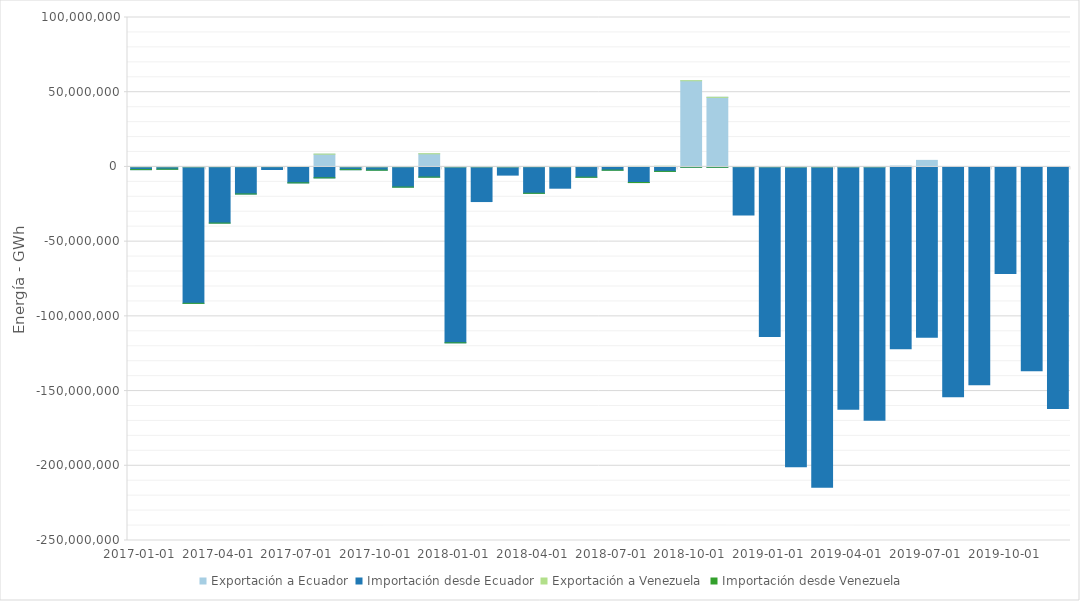
| Category |  Exportación a Ecuador  |  Importación desde Ecuador  | Exportación a Venezuela |  Importación desde Venezuela  |
|---|---|---|---|---|
| 2017-01-01 | 79147.28 | -1801463.38 | 34710 | -150 |
| 2017-02-01 | 83866.44 | -1515556.33 | 38460 | -60 |
| 2017-03-01 | 39413.34 | -91265572.43 | 48300 | -1530 |
| 2017-04-01 | 141564.44 | -37586324.52 | 39000 | -30 |
| 2017-05-01 | 153859.21 | -18103285.48 | 41610 | -720 |
| 2017-06-01 | 172976.55 | -1724930.96 | 35130 | 0 |
| 2017-07-01 | 273323.64 | -10659418.93 | 32670 | -90 |
| 2017-08-01 | 8542707.88 | -7312822.69 | 24810 | -1050 |
| 2017-09-01 | 67208.35 | -1837063.51 | 26040 | -270 |
| 2017-10-01 | 47232.05 | -2143346.01 | 23160 | -240 |
| 2017-11-01 | 127073.61 | -13480878.26 | 23610 | -810 |
| 2017-12-01 | 8789574.82 | -6800279.21 | 42300 | -30 |
| 2018-01-01 | 19337.97 | -117706000.44 | 38340 | -210 |
| 2018-02-01 | 42339.46 | -23174530.21 | 50550 | 0 |
| 2018-03-01 | 17912.5 | -5477847.87 | 81630 | 0 |
| 2018-04-01 | 158983.56 | -17619642.81 | 51900 | -210 |
| 2018-05-01 | 130522.04 | -14236743.92 | 30180 | 0 |
| 2018-06-01 | 226854.51 | -6865423.08 | 4350 | -4020 |
| 2018-07-01 | 314684.5 | -2158801.67 | 7500 | -6570 |
| 2018-08-01 | 348377.3 | -10448697.51 | 6150 | -6090 |
| 2018-09-01 | 394667.46 | -2954570.92 | 12270 | -5700 |
| 2018-10-01 | 57674568.52 | -121575.98 | 7590 | -2490 |
| 2018-11-01 | 46566080.92 | -163361.3 | 6870 | -210 |
| 2018-12-01 | 177266.76 | -32228959.5 | 6570 | 0 |
| 2019-01-01 | 83851.81 | -113516570.77 | 3630 | 0 |
| 2019-02-01 | 0 | -200707848.95 | 3900 | 0 |
| 2019-03-01 | 11905.49 | -214346861.99 | 2610 | 0 |
| 2019-04-01 | 28397.22 | -162135341.94 | 1110 | 0 |
| 2019-05-01 | 60887.09 | -169541435.84 | 120 | 0 |
| 2019-06-01 | 606229.36 | -121688325.43 | 0 | 0 |
| 2019-07-01 | 4378812.65 | -113903506.12 | 0 | 0 |
| 2019-08-01 | 146839.39 | -153834855.62 | 0 | 0 |
| 2019-09-01 | 89065.55 | -145781145.77 | 0 | 0 |
| 2019-10-01 | 262982.09 | -71290692.41 | 0 | 0 |
| 2019-11-01 | 112171.28 | -136341942.65 | 0 | 0 |
| 2019-12-01 | 48077.66 | -161732618.46 | 0 | 0 |